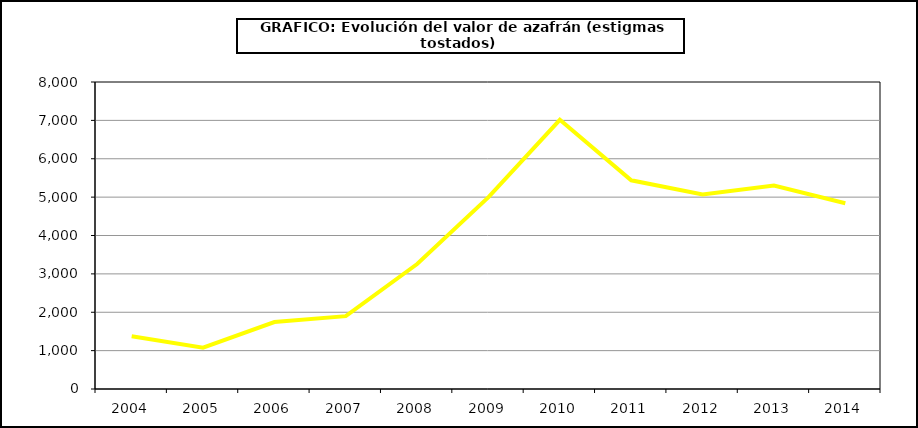
| Category | Valor |
|---|---|
| 2004.0 | 1373.604 |
| 2005.0 | 1076.135 |
| 2006.0 | 1745.439 |
| 2007.0 | 1898.858 |
| 2008.0 | 3257.208 |
| 2009.0 | 5000.541 |
| 2010.0 | 7014.469 |
| 2011.0 | 5438.177 |
| 2012.0 | 5071.99 |
| 2013.0 | 5302.253 |
| 2014.0 | 4841.325 |